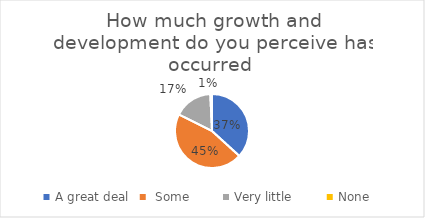
| Category | How much growth and development do you perceive has occurred  |
|---|---|
| A great deal   | 50 |
|  Some         | 62 |
| Very little         | 23 |
| None | 1 |